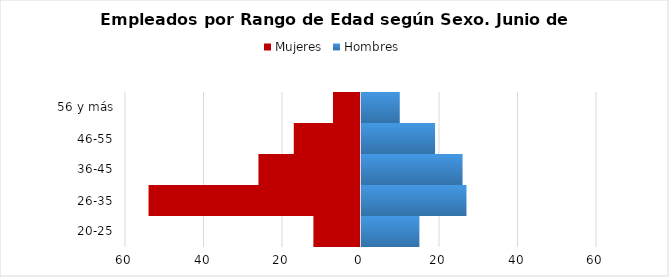
| Category | Mujeres | Hombres |
|---|---|---|
| 20-25 | -12 | 15 |
| 26-35 | -54 | 27 |
| 36-45 | -26 | 26 |
| 46-55 | -17 | 19 |
| 56 y más | -7 | 10 |